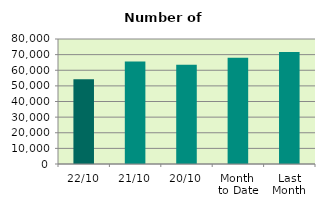
| Category | Series 0 |
|---|---|
| 22/10 | 54196 |
| 21/10 | 65572 |
| 20/10 | 63570 |
| Month 
to Date | 68051 |
| Last
Month | 71692 |